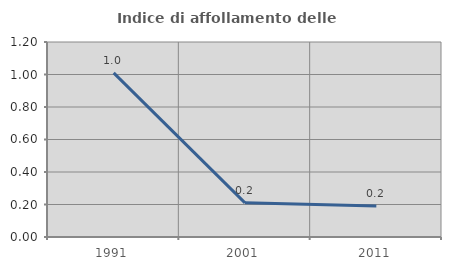
| Category | Indice di affollamento delle abitazioni  |
|---|---|
| 1991.0 | 1.01 |
| 2001.0 | 0.21 |
| 2011.0 | 0.19 |